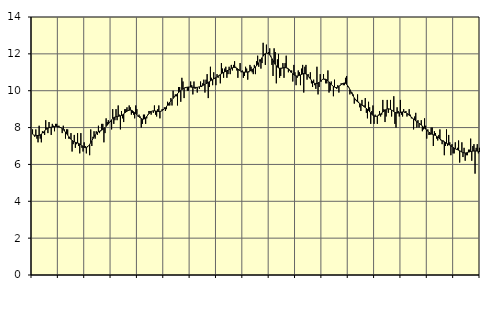
| Category | Piggar | Series 1 |
|---|---|---|
| nan | 7.9 | 7.65 |
| 87.0 | 7.6 | 7.59 |
| 87.0 | 7.5 | 7.58 |
| 87.0 | 7.9 | 7.58 |
| 87.0 | 7.4 | 7.57 |
| 87.0 | 7.2 | 7.57 |
| 87.0 | 8.1 | 7.58 |
| 87.0 | 7.4 | 7.6 |
| 87.0 | 7.2 | 7.65 |
| 87.0 | 7.8 | 7.7 |
| 87.0 | 7.7 | 7.76 |
| 87.0 | 7.6 | 7.83 |
| nan | 8.4 | 7.88 |
| 88.0 | 8 | 7.93 |
| 88.0 | 7.7 | 7.97 |
| 88.0 | 8.3 | 7.99 |
| 88.0 | 8 | 8.01 |
| 88.0 | 7.6 | 8.02 |
| 88.0 | 8.2 | 8.03 |
| 88.0 | 8.1 | 8.04 |
| 88.0 | 7.8 | 8.05 |
| 88.0 | 8.2 | 8.06 |
| 88.0 | 8.2 | 8.06 |
| 88.0 | 8 | 8.06 |
| nan | 8.1 | 8.04 |
| 89.0 | 8 | 8.02 |
| 89.0 | 8 | 7.98 |
| 89.0 | 7.7 | 7.94 |
| 89.0 | 8.1 | 7.89 |
| 89.0 | 7.9 | 7.82 |
| 89.0 | 7.4 | 7.75 |
| 89.0 | 7.9 | 7.67 |
| 89.0 | 7.9 | 7.59 |
| 89.0 | 7.4 | 7.51 |
| 89.0 | 7.4 | 7.43 |
| 89.0 | 7.7 | 7.36 |
| nan | 6.7 | 7.31 |
| 90.0 | 7.1 | 7.26 |
| 90.0 | 7.6 | 7.23 |
| 90.0 | 6.9 | 7.2 |
| 90.0 | 7.1 | 7.18 |
| 90.0 | 7.7 | 7.16 |
| 90.0 | 7 | 7.14 |
| 90.0 | 6.6 | 7.11 |
| 90.0 | 7.7 | 7.07 |
| 90.0 | 6.9 | 7.02 |
| 90.0 | 6.7 | 6.97 |
| 90.0 | 7.2 | 6.93 |
| nan | 7 | 6.91 |
| 91.0 | 6.6 | 6.92 |
| 91.0 | 7 | 6.95 |
| 91.0 | 7 | 7 |
| 91.0 | 6.5 | 7.08 |
| 91.0 | 7.9 | 7.18 |
| 91.0 | 7 | 7.28 |
| 91.0 | 7.5 | 7.4 |
| 91.0 | 7.8 | 7.51 |
| 91.0 | 7.4 | 7.61 |
| 91.0 | 7.8 | 7.68 |
| 91.0 | 7.6 | 7.74 |
| nan | 8.1 | 7.77 |
| 92.0 | 7.7 | 7.8 |
| 92.0 | 7.8 | 7.83 |
| 92.0 | 8.2 | 7.86 |
| 92.0 | 8.2 | 7.9 |
| 92.0 | 7.2 | 7.95 |
| 92.0 | 7.7 | 8 |
| 92.0 | 8.5 | 8.06 |
| 92.0 | 8.3 | 8.13 |
| 92.0 | 8.4 | 8.2 |
| 92.0 | 8.3 | 8.28 |
| 92.0 | 8.3 | 8.35 |
| nan | 7.9 | 8.42 |
| 93.0 | 9 | 8.49 |
| 93.0 | 8.2 | 8.54 |
| 93.0 | 8.4 | 8.57 |
| 93.0 | 9 | 8.59 |
| 93.0 | 8.4 | 8.6 |
| 93.0 | 9.2 | 8.61 |
| 93.0 | 8.7 | 8.62 |
| 93.0 | 7.9 | 8.64 |
| 93.0 | 8.9 | 8.66 |
| 93.0 | 8.5 | 8.69 |
| 93.0 | 8.3 | 8.74 |
| nan | 9 | 8.79 |
| 94.0 | 9 | 8.84 |
| 94.0 | 9.1 | 8.89 |
| 94.0 | 8.9 | 8.92 |
| 94.0 | 9.2 | 8.94 |
| 94.0 | 9.1 | 8.95 |
| 94.0 | 8.7 | 8.94 |
| 94.0 | 8.8 | 8.91 |
| 94.0 | 8.7 | 8.86 |
| 94.0 | 8.5 | 8.81 |
| 94.0 | 9.2 | 8.76 |
| 94.0 | 9 | 8.7 |
| nan | 8.6 | 8.64 |
| 95.0 | 8.7 | 8.58 |
| 95.0 | 8.6 | 8.53 |
| 95.0 | 8 | 8.49 |
| 95.0 | 8.2 | 8.46 |
| 95.0 | 8.7 | 8.46 |
| 95.0 | 8.7 | 8.48 |
| 95.0 | 8.2 | 8.53 |
| 95.0 | 8.5 | 8.6 |
| 95.0 | 8.7 | 8.68 |
| 95.0 | 8.9 | 8.75 |
| 95.0 | 8.9 | 8.82 |
| nan | 8.7 | 8.87 |
| 96.0 | 8.9 | 8.9 |
| 96.0 | 8.8 | 8.91 |
| 96.0 | 9.2 | 8.91 |
| 96.0 | 8.7 | 8.9 |
| 96.0 | 8.6 | 8.89 |
| 96.0 | 9 | 8.87 |
| 96.0 | 9.2 | 8.87 |
| 96.0 | 8.5 | 8.87 |
| 96.0 | 8.9 | 8.89 |
| 96.0 | 9 | 8.92 |
| 96.0 | 9 | 8.96 |
| nan | 9.1 | 9.01 |
| 97.0 | 8.9 | 9.07 |
| 97.0 | 9 | 9.14 |
| 97.0 | 9.4 | 9.22 |
| 97.0 | 9.2 | 9.3 |
| 97.0 | 9.2 | 9.37 |
| 97.0 | 9.6 | 9.45 |
| 97.0 | 9.2 | 9.51 |
| 97.0 | 10 | 9.58 |
| 97.0 | 9.7 | 9.65 |
| 97.0 | 9.8 | 9.71 |
| 97.0 | 9.7 | 9.78 |
| nan | 9.2 | 9.84 |
| 98.0 | 10.2 | 9.9 |
| 98.0 | 10.2 | 9.96 |
| 98.0 | 9.4 | 10.01 |
| 98.0 | 10.7 | 10.06 |
| 98.0 | 10.5 | 10.1 |
| 98.0 | 9.6 | 10.13 |
| 98.0 | 10.2 | 10.16 |
| 98.0 | 10.2 | 10.18 |
| 98.0 | 10 | 10.19 |
| 98.0 | 10 | 10.2 |
| 98.0 | 10.2 | 10.2 |
| nan | 10.5 | 10.2 |
| 99.0 | 10.3 | 10.19 |
| 99.0 | 9.8 | 10.19 |
| 99.0 | 10.5 | 10.18 |
| 99.0 | 10.1 | 10.18 |
| 99.0 | 10.2 | 10.18 |
| 99.0 | 9.9 | 10.18 |
| 99.0 | 10.2 | 10.2 |
| 99.0 | 10.1 | 10.21 |
| 99.0 | 10.5 | 10.23 |
| 99.0 | 10.2 | 10.26 |
| 99.0 | 10.4 | 10.28 |
| nan | 10.6 | 10.31 |
| 0.0 | 9.9 | 10.34 |
| 0.0 | 10.6 | 10.38 |
| 0.0 | 10.9 | 10.41 |
| 0.0 | 9.6 | 10.45 |
| 0.0 | 10.2 | 10.49 |
| 0.0 | 11.3 | 10.53 |
| 0.0 | 10.7 | 10.57 |
| 0.0 | 10.3 | 10.6 |
| 0.0 | 11 | 10.64 |
| 0.0 | 10.7 | 10.67 |
| 0.0 | 10.3 | 10.71 |
| nan | 10.9 | 10.75 |
| 1.0 | 10.7 | 10.79 |
| 1.0 | 10.8 | 10.83 |
| 1.0 | 10.4 | 10.88 |
| 1.0 | 11.5 | 10.92 |
| 1.0 | 11.2 | 10.96 |
| 1.0 | 10.7 | 10.99 |
| 1.0 | 11.2 | 11.02 |
| 1.0 | 11.3 | 11.05 |
| 1.0 | 10.7 | 11.08 |
| 1.0 | 10.9 | 11.11 |
| 1.0 | 11.3 | 11.14 |
| nan | 10.9 | 11.18 |
| 2.0 | 11.4 | 11.21 |
| 2.0 | 11.1 | 11.24 |
| 2.0 | 11.4 | 11.26 |
| 2.0 | 11.6 | 11.26 |
| 2.0 | 11.3 | 11.25 |
| 2.0 | 11.1 | 11.22 |
| 2.0 | 10.7 | 11.18 |
| 2.0 | 11.1 | 11.13 |
| 2.0 | 11.5 | 11.09 |
| 2.0 | 11 | 11.05 |
| 2.0 | 11.1 | 11.02 |
| nan | 10.7 | 11.01 |
| 3.0 | 10.8 | 11.01 |
| 3.0 | 11.3 | 11.01 |
| 3.0 | 11.2 | 11.01 |
| 3.0 | 10.6 | 11.02 |
| 3.0 | 11 | 11.04 |
| 3.0 | 11.4 | 11.07 |
| 3.0 | 11.3 | 11.1 |
| 3.0 | 11 | 11.14 |
| 3.0 | 10.9 | 11.19 |
| 3.0 | 11.4 | 11.24 |
| 3.0 | 10.9 | 11.29 |
| nan | 11.6 | 11.36 |
| 4.0 | 11.9 | 11.43 |
| 4.0 | 11.3 | 11.51 |
| 4.0 | 11.7 | 11.59 |
| 4.0 | 11.2 | 11.69 |
| 4.0 | 11.5 | 11.79 |
| 4.0 | 12.6 | 11.88 |
| 4.0 | 12 | 11.96 |
| 4.0 | 11.4 | 12.01 |
| 4.0 | 12.5 | 12.04 |
| 4.0 | 12 | 12.03 |
| 4.0 | 12.1 | 12 |
| nan | 12.3 | 11.94 |
| 5.0 | 11.9 | 11.85 |
| 5.0 | 11.4 | 11.74 |
| 5.0 | 10.8 | 11.64 |
| 5.0 | 12.3 | 11.53 |
| 5.0 | 12.1 | 11.43 |
| 5.0 | 10.4 | 11.35 |
| 5.0 | 11.7 | 11.28 |
| 5.0 | 12 | 11.24 |
| 5.0 | 10.7 | 11.22 |
| 5.0 | 10.8 | 11.22 |
| 5.0 | 11.2 | 11.23 |
| nan | 11.5 | 11.24 |
| 6.0 | 10.7 | 11.25 |
| 6.0 | 11.5 | 11.25 |
| 6.0 | 11.9 | 11.25 |
| 6.0 | 11.2 | 11.23 |
| 6.0 | 11 | 11.19 |
| 6.0 | 11.1 | 11.14 |
| 6.0 | 11 | 11.07 |
| 6.0 | 11.1 | 10.99 |
| 6.0 | 10.5 | 10.92 |
| 6.0 | 11.4 | 10.87 |
| 6.0 | 11 | 10.83 |
| nan | 10.3 | 10.8 |
| 7.0 | 10.7 | 10.8 |
| 7.0 | 11.1 | 10.81 |
| 7.0 | 11 | 10.83 |
| 7.0 | 10.3 | 10.86 |
| 7.0 | 11.2 | 10.88 |
| 7.0 | 11.4 | 10.91 |
| 7.0 | 9.9 | 10.93 |
| 7.0 | 11.3 | 10.93 |
| 7.0 | 11.4 | 10.91 |
| 7.0 | 10.6 | 10.87 |
| 7.0 | 10.9 | 10.81 |
| nan | 10.7 | 10.73 |
| 8.0 | 11 | 10.65 |
| 8.0 | 10.4 | 10.57 |
| 8.0 | 10.2 | 10.49 |
| 8.0 | 10.6 | 10.44 |
| 8.0 | 10.3 | 10.4 |
| 8.0 | 10.1 | 10.38 |
| 8.0 | 11.3 | 10.39 |
| 8.0 | 9.8 | 10.42 |
| 8.0 | 10.2 | 10.46 |
| 8.0 | 10.9 | 10.51 |
| 8.0 | 10.5 | 10.56 |
| nan | 10.6 | 10.61 |
| 9.0 | 10.9 | 10.63 |
| 9.0 | 10.6 | 10.63 |
| 9.0 | 10.4 | 10.62 |
| 9.0 | 10.4 | 10.59 |
| 9.0 | 11.1 | 10.54 |
| 9.0 | 9.9 | 10.48 |
| 9.0 | 10 | 10.41 |
| 9.0 | 10.5 | 10.34 |
| 9.0 | 10.3 | 10.28 |
| 9.0 | 9.7 | 10.23 |
| 9.0 | 10.6 | 10.2 |
| nan | 10.2 | 10.17 |
| 10.0 | 10.1 | 10.17 |
| 10.0 | 10.3 | 10.19 |
| 10.0 | 9.9 | 10.23 |
| 10.0 | 10.3 | 10.28 |
| 10.0 | 10.4 | 10.33 |
| 10.0 | 10.4 | 10.37 |
| 10.0 | 10.3 | 10.4 |
| 10.0 | 10.3 | 10.42 |
| 10.0 | 10.7 | 10.4 |
| 10.0 | 10.8 | 10.35 |
| 10.0 | 10.2 | 10.27 |
| nan | 10.2 | 10.18 |
| 11.0 | 9.8 | 10.06 |
| 11.0 | 9.9 | 9.94 |
| 11.0 | 9.9 | 9.83 |
| 11.0 | 9.8 | 9.71 |
| 11.0 | 9.3 | 9.61 |
| 11.0 | 9.5 | 9.53 |
| 11.0 | 9.5 | 9.45 |
| 11.0 | 9.8 | 9.39 |
| 11.0 | 9.4 | 9.35 |
| 11.0 | 9.1 | 9.3 |
| 11.0 | 8.9 | 9.26 |
| nan | 9.5 | 9.22 |
| 12.0 | 9.2 | 9.18 |
| 12.0 | 9.2 | 9.13 |
| 12.0 | 9.6 | 9.09 |
| 12.0 | 8.8 | 9.04 |
| 12.0 | 8.5 | 8.99 |
| 12.0 | 9.4 | 8.93 |
| 12.0 | 9.1 | 8.86 |
| 12.0 | 8.2 | 8.79 |
| 12.0 | 8.9 | 8.72 |
| 12.0 | 9.2 | 8.66 |
| 12.0 | 8.2 | 8.63 |
| nan | 8.7 | 8.61 |
| 13.0 | 8.6 | 8.61 |
| 13.0 | 8.2 | 8.63 |
| 13.0 | 8.7 | 8.66 |
| 13.0 | 8.9 | 8.69 |
| 13.0 | 8.6 | 8.74 |
| 13.0 | 8.7 | 8.79 |
| 13.0 | 9.5 | 8.84 |
| 13.0 | 9 | 8.89 |
| 13.0 | 8.3 | 8.94 |
| 13.0 | 8.6 | 8.98 |
| 13.0 | 9.5 | 9.01 |
| nan | 8.8 | 9.02 |
| 14.0 | 9 | 9.01 |
| 14.0 | 9.5 | 8.98 |
| 14.0 | 8.6 | 8.95 |
| 14.0 | 8.9 | 8.91 |
| 14.0 | 9.7 | 8.87 |
| 14.0 | 8.2 | 8.83 |
| 14.0 | 8 | 8.81 |
| 14.0 | 9.1 | 8.79 |
| 14.0 | 8.9 | 8.79 |
| 14.0 | 8.6 | 8.8 |
| 14.0 | 9.5 | 8.82 |
| nan | 8.7 | 8.84 |
| 15.0 | 8.6 | 8.85 |
| 15.0 | 9 | 8.86 |
| 15.0 | 8.8 | 8.84 |
| 15.0 | 8.9 | 8.81 |
| 15.0 | 8.6 | 8.77 |
| 15.0 | 8.7 | 8.72 |
| 15.0 | 9 | 8.67 |
| 15.0 | 8.7 | 8.62 |
| 15.0 | 8.5 | 8.57 |
| 15.0 | 8.5 | 8.52 |
| 15.0 | 7.9 | 8.47 |
| nan | 8.6 | 8.41 |
| 16.0 | 8.8 | 8.36 |
| 16.0 | 8 | 8.32 |
| 16.0 | 8.4 | 8.28 |
| 16.0 | 8 | 8.23 |
| 16.0 | 8.2 | 8.19 |
| 16.0 | 8.4 | 8.14 |
| 16.0 | 7.8 | 8.08 |
| 16.0 | 7.9 | 8.03 |
| 16.0 | 8.5 | 7.97 |
| 16.0 | 8.1 | 7.91 |
| 16.0 | 7.4 | 7.86 |
| nan | 7.9 | 7.81 |
| 17.0 | 7.6 | 7.75 |
| 17.0 | 7.6 | 7.71 |
| 17.0 | 8 | 7.66 |
| 17.0 | 8 | 7.63 |
| 17.0 | 7 | 7.61 |
| 17.0 | 7.8 | 7.59 |
| 17.0 | 7.7 | 7.57 |
| 17.0 | 7.4 | 7.53 |
| 17.0 | 7.3 | 7.49 |
| 17.0 | 7.6 | 7.43 |
| 17.0 | 7.9 | 7.38 |
| nan | 7.3 | 7.33 |
| 18.0 | 7.1 | 7.29 |
| 18.0 | 7.3 | 7.26 |
| 18.0 | 6.5 | 7.23 |
| 18.0 | 7 | 7.19 |
| 18.0 | 7.9 | 7.15 |
| 18.0 | 7 | 7.12 |
| 18.0 | 7.6 | 7.08 |
| 18.0 | 7.2 | 7.05 |
| 18.0 | 6.5 | 7.01 |
| 18.0 | 7.1 | 6.97 |
| 18.0 | 6.6 | 6.92 |
| nan | 6.6 | 6.88 |
| 19.0 | 7.2 | 6.85 |
| 19.0 | 6.8 | 6.82 |
| 19.0 | 6.9 | 6.8 |
| 19.0 | 7.3 | 6.77 |
| 19.0 | 6.1 | 6.74 |
| 19.0 | 6.7 | 6.71 |
| 19.0 | 7.2 | 6.67 |
| 19.0 | 6.4 | 6.64 |
| 19.0 | 6.9 | 6.63 |
| 19.0 | 6.2 | 6.62 |
| 19.0 | 6.5 | 6.63 |
| nan | 6.5 | 6.65 |
| 20.0 | 6.8 | 6.67 |
| 20.0 | 6.8 | 6.68 |
| 20.0 | 7.4 | 6.7 |
| 20.0 | 6.2 | 6.71 |
| 20.0 | 7 | 6.72 |
| 20.0 | 7.1 | 6.73 |
| 20.0 | 5.5 | 6.73 |
| 20.0 | 6.9 | 6.73 |
| 20.0 | 7.1 | 6.72 |
| 20.0 | 6.6 | 6.7 |
| 20.0 | 6.9 | 6.68 |